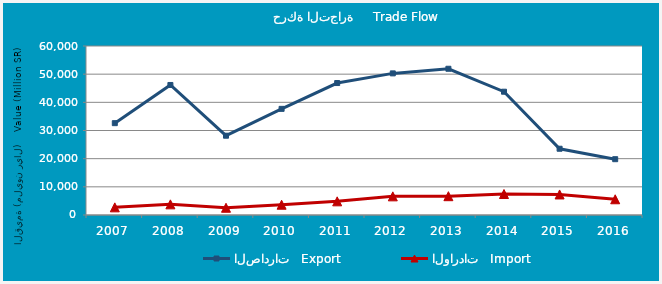
| Category | الصادرات   Export | الواردات   Import |
|---|---|---|
| 2007.0 | 32604.509 | 2716.528 |
| 2008.0 | 46164.915 | 3777.893 |
| 2009.0 | 28151.118 | 2569.67 |
| 2010.0 | 37685.232 | 3648.764 |
| 2011.0 | 46847.799 | 4853.006 |
| 2012.0 | 50277.389 | 6621.533 |
| 2013.0 | 51920.686 | 6674.963 |
| 2014.0 | 43770.672 | 7459.547 |
| 2015.0 | 23523.616 | 7294.215 |
| 2016.0 | 19813.772 | 5585.703 |